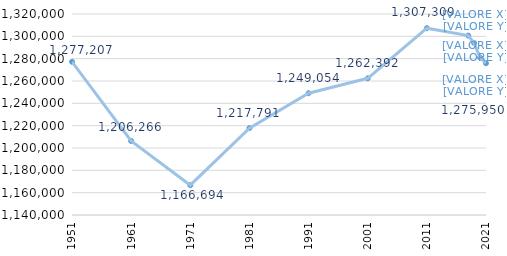
| Category | Series 0 |
|---|---|
| 1951.0 | 1277207 |
| 1961.0 | 1206266 |
| 1971.0 | 1166694 |
| 1981.0 | 1217791 |
| 1991.0 | 1249054 |
| 2001.0 | 1262392 |
| 2011.0 | 1307309 |
| 2018.0 | 1300645 |
| 2019.0 | 1293941 |
| 2020.0 | 1281012 |
| 2021.0 | 1275950 |